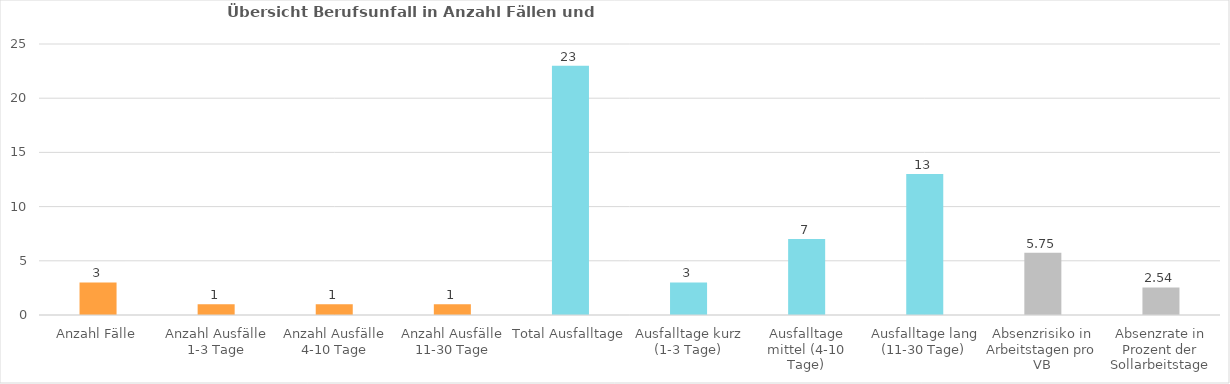
| Category | Berufsunfall |
|---|---|
| Anzahl Fälle | 3 |
| Anzahl Ausfälle 1-3 Tage | 1 |
| Anzahl Ausfälle 4-10 Tage | 1 |
| Anzahl Ausfälle 11-30 Tage | 1 |
| Total Ausfalltage | 23 |
| Ausfalltage kurz (1-3 Tage) | 3 |
| Ausfalltage mittel (4-10 Tage) | 7 |
| Ausfalltage lang (11-30 Tage) | 13 |
| Absenzrisiko in Arbeitstagen pro VB | 5.75 |
| Absenzrate in Prozent der Sollarbeitstage | 2.544 |